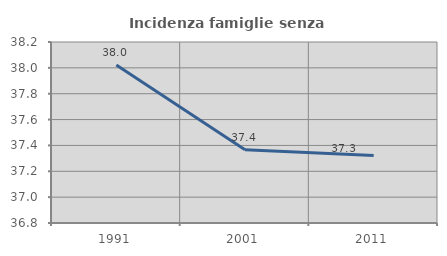
| Category | Incidenza famiglie senza nuclei |
|---|---|
| 1991.0 | 38.022 |
| 2001.0 | 37.367 |
| 2011.0 | 37.323 |